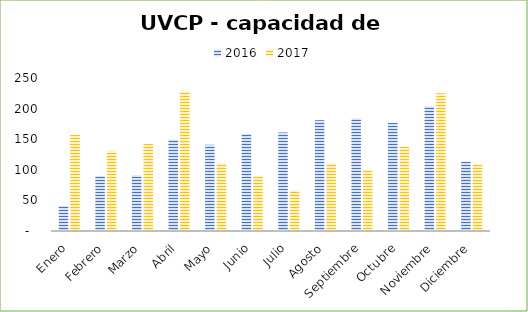
| Category | 2016 | 2017 |
|---|---|---|
| Enero | 41 | 157 |
| Febrero | 90 | 131 |
| Marzo | 91 | 142 |
| Abril | 149 | 228 |
| Mayo | 141 | 111 |
| Junio | 159 | 90 |
| Julio | 161 | 67 |
| Agosto | 181 | 111 |
| Septiembre | 184 | 100 |
| Octubre | 177 | 138 |
| Noviembre | 204 | 225 |
| Diciembre | 113 | 110 |